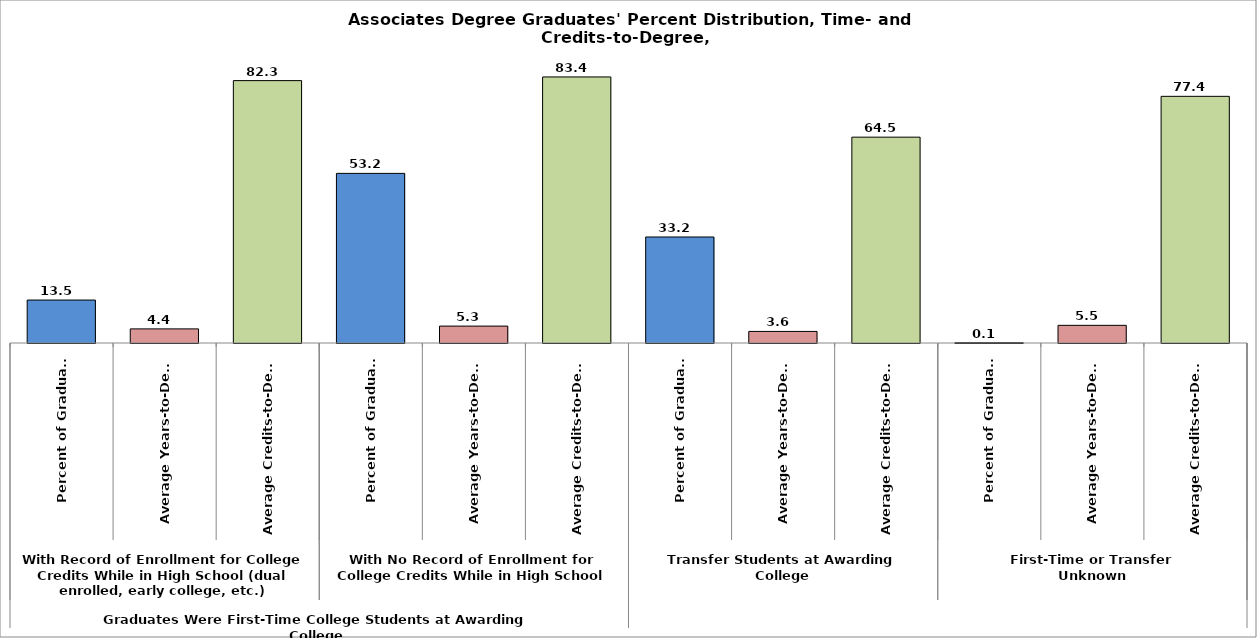
| Category | Series 10 |
|---|---|
| 0 | 13.465 |
| 1 | 4.425 |
| 2 | 82.281 |
| 3 | 53.19 |
| 4 | 5.3 |
| 5 | 83.43 |
| 6 | 33.244 |
| 7 | 3.632 |
| 8 | 64.547 |
| 9 | 0.101 |
| 10 | 5.538 |
| 11 | 77.35 |